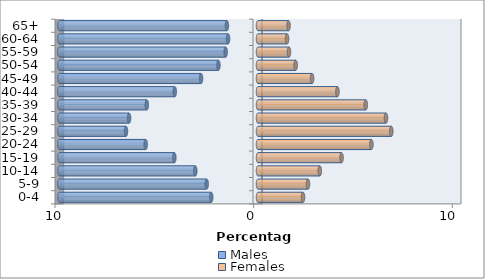
| Category | Males | Females |
|---|---|---|
| 0-4 | -2.355 | 2.266 |
| 5-9 | -2.583 | 2.516 |
| 10-14 | -3.158 | 3.112 |
| 15-19 | -4.211 | 4.205 |
| 20-24 | -5.654 | 5.708 |
| 25-29 | -6.646 | 6.707 |
| 30-34 | -6.49 | 6.442 |
| 35-39 | -5.597 | 5.426 |
| 40-44 | -4.19 | 3.997 |
| 45-49 | -2.867 | 2.723 |
| 50-54 | -1.993 | 1.896 |
| 55-59 | -1.627 | 1.558 |
| 60-64 | -1.508 | 1.463 |
| 65+ | -1.565 | 1.538 |